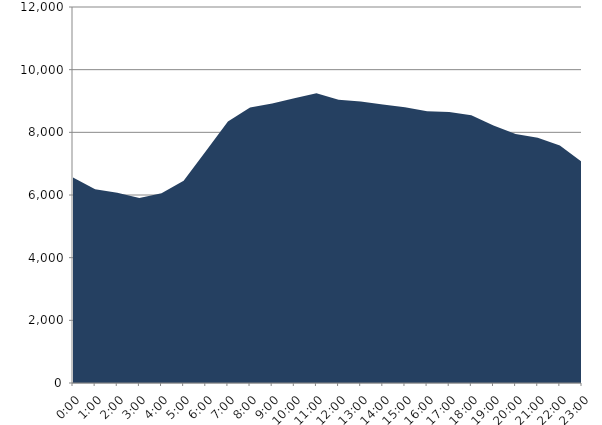
| Category | Series 0 | Series 1 |
|---|---|---|
| 2016-07-20 |  | 6558.463 |
| 2016-07-20 01:00:00 |  | 6185.001 |
| 2016-07-20 02:00:00 |  | 6072.681 |
| 2016-07-20 03:00:00 |  | 5903.671 |
| 2016-07-20 04:00:00 |  | 6052.976 |
| 2016-07-20 05:00:00 |  | 6458.657 |
| 2016-07-20 06:00:00 |  | 7394.875 |
| 2016-07-20 07:00:00 |  | 8347.033 |
| 2016-07-20 08:00:00 |  | 8792.401 |
| 2016-07-20 09:00:00 |  | 8923.019 |
| 2016-07-20 10:00:00 |  | 9091.438 |
| 2016-07-20 11:00:00 |  | 9246.836 |
| 2016-07-20 12:00:00 |  | 9042.757 |
| 2016-07-20 13:00:00 |  | 8981.287 |
| 2016-07-20 14:00:00 |  | 8886.811 |
| 2016-07-20 15:00:00 |  | 8797.63 |
| 2016-07-20 16:00:00 |  | 8675.625 |
| 2016-07-20 17:00:00 |  | 8651.096 |
| 2016-07-20 18:00:00 |  | 8542.97 |
| 2016-07-20 19:00:00 |  | 8218.313 |
| 2016-07-20 20:00:00 |  | 7948.698 |
| 2016-07-20 21:00:00 |  | 7829.166 |
| 2016-07-20 22:00:00 |  | 7583.726 |
| 2016-07-20 23:00:00 |  | 7054.977 |